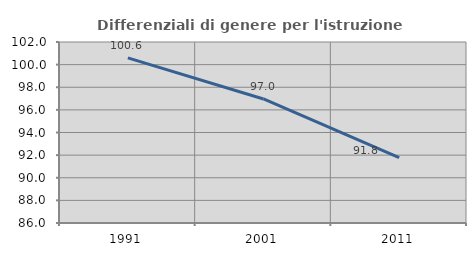
| Category | Differenziali di genere per l'istruzione superiore |
|---|---|
| 1991.0 | 100.598 |
| 2001.0 | 96.963 |
| 2011.0 | 91.778 |